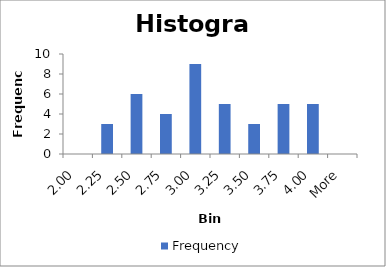
| Category | Frequency |
|---|---|
| 2.00 | 0 |
| 2.25 | 3 |
| 2.50 | 6 |
| 2.75 | 4 |
| 3.00 | 9 |
| 3.25 | 5 |
| 3.50 | 3 |
| 3.75 | 5 |
| 4.00 | 5 |
| More | 0 |